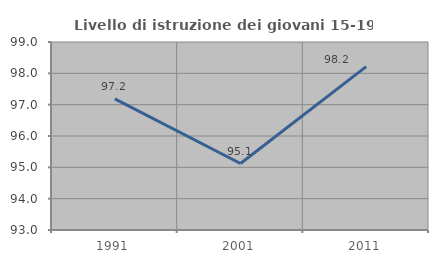
| Category | Livello di istruzione dei giovani 15-19 anni |
|---|---|
| 1991.0 | 97.183 |
| 2001.0 | 95.122 |
| 2011.0 | 98.214 |